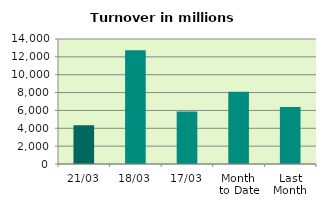
| Category | Series 0 |
|---|---|
| 21/03 | 4341.12 |
| 18/03 | 12749.602 |
| 17/03 | 5886.225 |
| Month 
to Date | 8090.759 |
| Last
Month | 6378.947 |